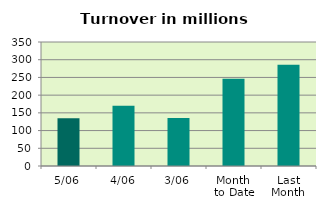
| Category | Series 0 |
|---|---|
| 5/06 | 135.13 |
| 4/06 | 169.718 |
| 3/06 | 135.411 |
| Month 
to Date | 246.333 |
| Last
Month | 285.992 |